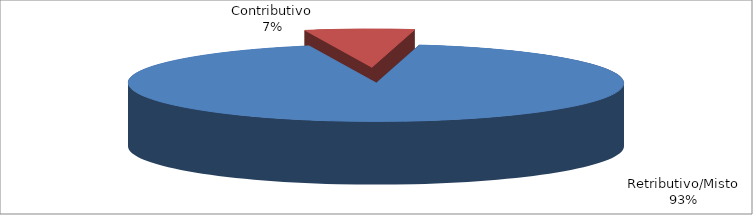
| Category | Decorrenti ANNO 2021 |
|---|---|
| Retributivo/Misto | 70123 |
| Contributivo | 5385 |